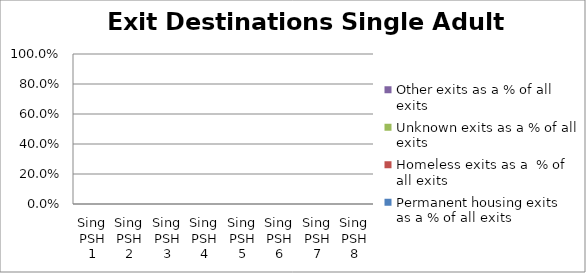
| Category | Permanent housing exits as a % of all exits | Homeless exits as a  % of all exits | Unknown exits as a % of all exits | Other exits as a % of all exits |
|---|---|---|---|---|
| Sing PSH 1 | 0 | 0 | 0 | 0 |
| Sing PSH 2 | 0 | 0 | 0 | 0 |
| Sing PSH 3 | 0 | 0 | 0 | 0 |
| Sing PSH 4 | 0 | 0 | 0 | 0 |
| Sing PSH 5 | 0 | 0 | 0 | 0 |
| Sing PSH 6 | 0 | 0 | 0 | 0 |
| Sing PSH 7 | 0 | 0 | 0 | 0 |
| Sing PSH 8 | 0 | 0 | 0 | 0 |